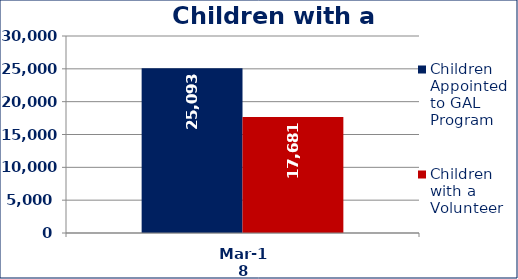
| Category | Children Appointed to GAL Program  | Children with a Volunteer  |
|---|---|---|
| Mar-18 | 25093 | 17681 |